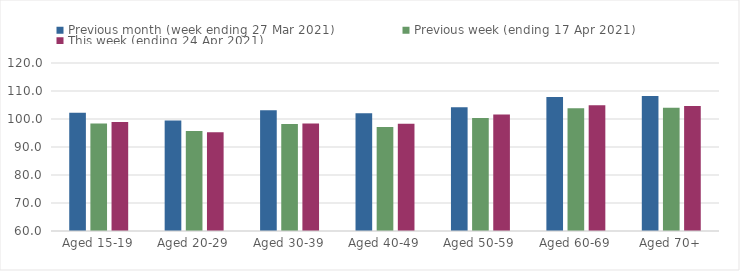
| Category | Previous month (week ending 27 Mar 2021) | Previous week (ending 17 Apr 2021) | This week (ending 24 Apr 2021) |
|---|---|---|---|
| Aged 15-19 | 102.21 | 98.37 | 98.9 |
| Aged 20-29 | 99.47 | 95.68 | 95.29 |
| Aged 30-39 | 103.09 | 98.21 | 98.43 |
| Aged 40-49 | 102.01 | 97.18 | 98.33 |
| Aged 50-59 | 104.19 | 100.34 | 101.58 |
| Aged 60-69 | 107.84 | 103.83 | 104.89 |
| Aged 70+ | 108.18 | 104.05 | 104.67 |